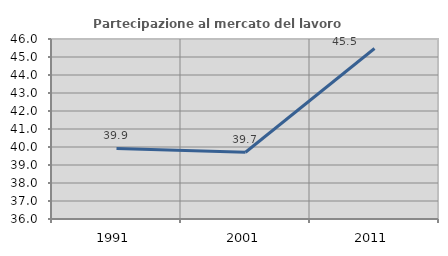
| Category | Partecipazione al mercato del lavoro  femminile |
|---|---|
| 1991.0 | 39.923 |
| 2001.0 | 39.71 |
| 2011.0 | 45.471 |